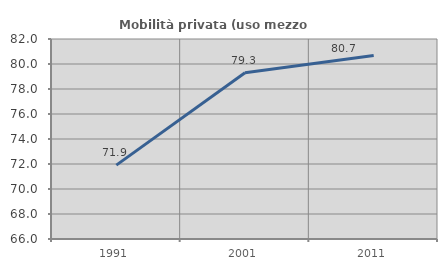
| Category | Mobilità privata (uso mezzo privato) |
|---|---|
| 1991.0 | 71.91 |
| 2001.0 | 79.297 |
| 2011.0 | 80.676 |